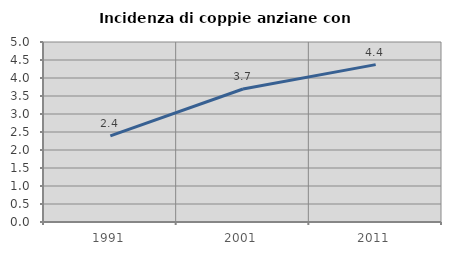
| Category | Incidenza di coppie anziane con figli |
|---|---|
| 1991.0 | 2.392 |
| 2001.0 | 3.695 |
| 2011.0 | 4.371 |